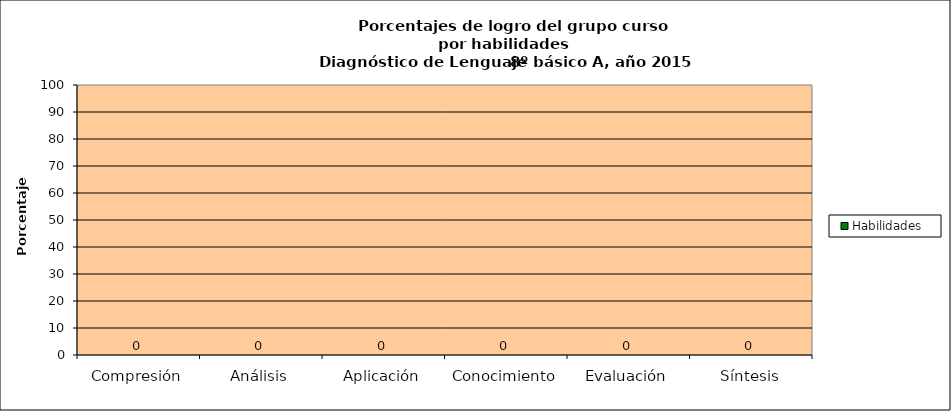
| Category | Habilidades |
|---|---|
| Compresión | 0 |
| Análisis | 0 |
| Aplicación | 0 |
| Conocimiento | 0 |
| Evaluación | 0 |
| Síntesis | 0 |